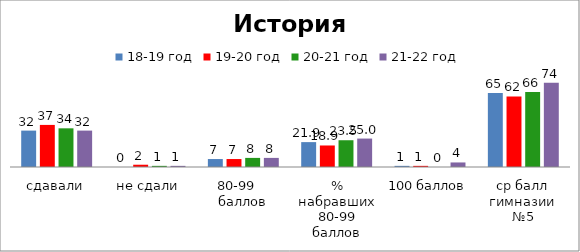
| Category | 18-19 год | 19-20 год | 20-21 год | 21-22 год |
|---|---|---|---|---|
| сдавали | 32 | 37 | 34 | 32 |
| не сдали | 0 | 2 | 1 | 1 |
| 80-99    баллов | 7 | 7 | 8 | 8 |
| % набравших 80-99 баллов | 21.875 | 18.919 | 23.529 | 25 |
| 100 баллов | 1 | 1 | 0 | 4 |
| ср балл гимназии №5 | 65 | 62 | 66 | 74 |